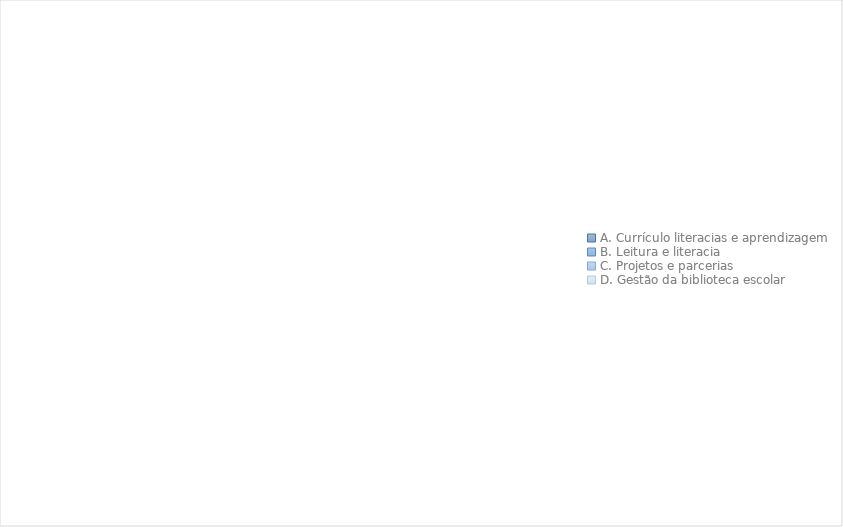
| Category | Series 0 |
|---|---|
| A. Currículo literacias e aprendizagem  | 0 |
| B. Leitura e literacia  | 0 |
| C. Projetos e parcerias  | 0 |
| D. Gestão da biblioteca escolar  | 0 |